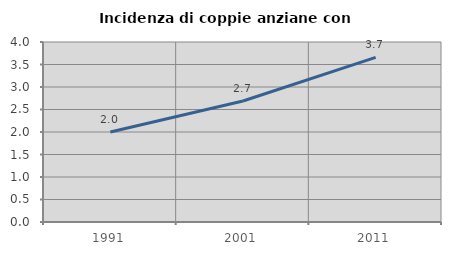
| Category | Incidenza di coppie anziane con figli |
|---|---|
| 1991.0 | 2 |
| 2001.0 | 2.688 |
| 2011.0 | 3.658 |